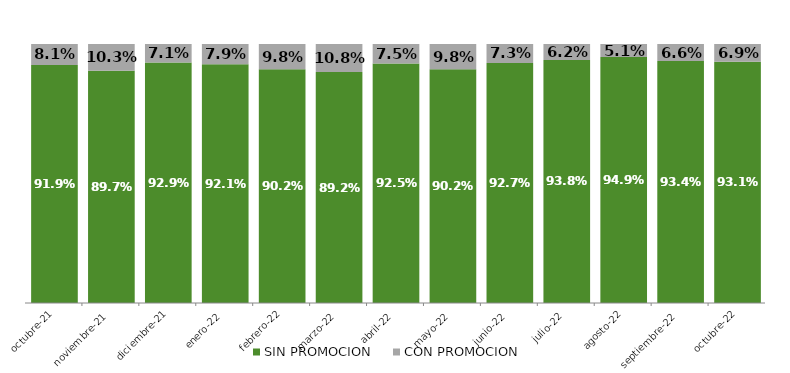
| Category | SIN PROMOCION   | CON PROMOCION   |
|---|---|---|
| 2021-10-01 | 0.919 | 0.081 |
| 2021-11-01 | 0.897 | 0.103 |
| 2021-12-01 | 0.929 | 0.071 |
| 2022-01-01 | 0.921 | 0.079 |
| 2022-02-01 | 0.902 | 0.098 |
| 2022-03-01 | 0.892 | 0.108 |
| 2022-04-01 | 0.925 | 0.075 |
| 2022-05-01 | 0.902 | 0.098 |
| 2022-06-01 | 0.927 | 0.073 |
| 2022-07-01 | 0.938 | 0.062 |
| 2022-08-01 | 0.949 | 0.051 |
| 2022-09-01 | 0.934 | 0.066 |
| 2022-10-01 | 0.931 | 0.069 |